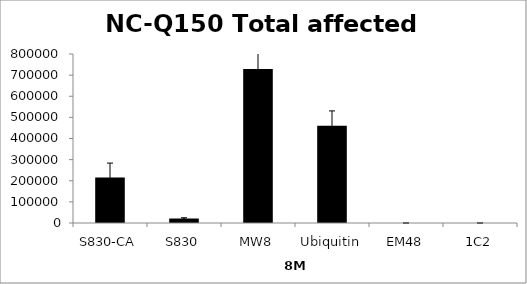
| Category | Ave |
|---|---|
| S830-CA | 215212.06 |
| S830 | 21242.381 |
| MW8 | 729092.121 |
| Ubiquitin | 460930.683 |
| EM48 | 0 |
| 1C2 | 0 |